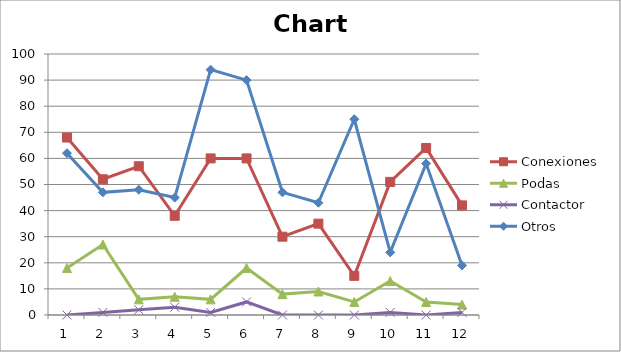
| Category | Conexiones  | Podas  | Contactor  | Otros  |
|---|---|---|---|---|
| 0 | 68 | 18 | 0 | 62 |
| 1 | 52 | 27 | 1 | 47 |
| 2 | 57 | 6 | 2 | 48 |
| 3 | 38 | 7 | 3 | 45 |
| 4 | 60 | 6 | 1 | 94 |
| 5 | 60 | 18 | 5 | 90 |
| 6 | 30 | 8 | 0 | 47 |
| 7 | 35 | 9 | 0 | 43 |
| 8 | 15 | 5 | 0 | 75 |
| 9 | 51 | 13 | 1 | 24 |
| 10 | 64 | 5 | 0 | 58 |
| 11 | 42 | 4 | 1 | 19 |